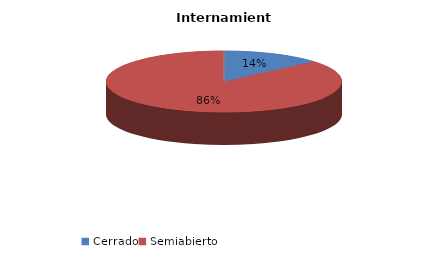
| Category | Series 0 |
|---|---|
| Cerrado | 3 |
| Semiabierto | 19 |
| Abierto | 0 |
| Terapeúticos | 0 |